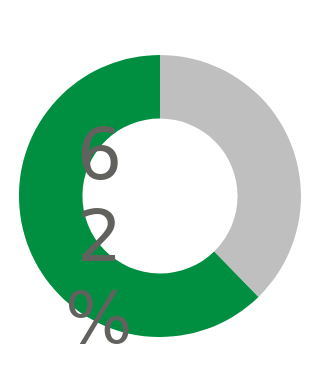
| Category | Series 0 |
|---|---|
| 0 | 0.377 |
| 1 | 0.623 |